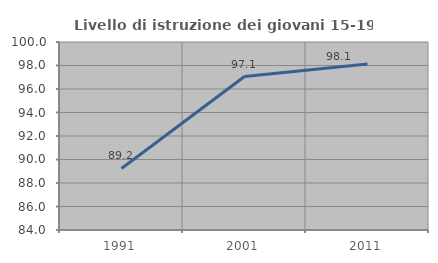
| Category | Livello di istruzione dei giovani 15-19 anni |
|---|---|
| 1991.0 | 89.241 |
| 2001.0 | 97.059 |
| 2011.0 | 98.131 |